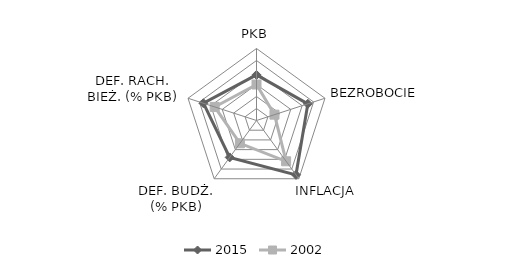
| Category | 2015 | 2002 |
|---|---|---|
| PKB | 7.6 | 6 |
| BEZROBOCIE | 8.996 | 3.151 |
| INFLACJA | 11.2 | 8.4 |
| DEF. BUDŻ. (% PKB) | 7.6 | 4.695 |
| DEF. RACH. BIEŻ. (% PKB) | 9.3 | 7.328 |